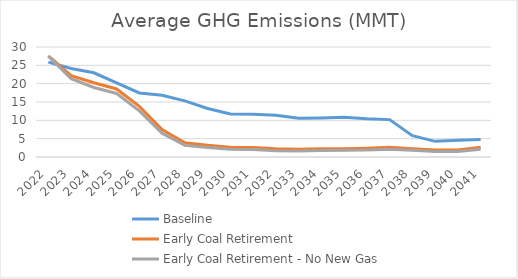
| Category | Baseline  | Early Coal Retirement | Early Coal Retirement - No New Gas |
|---|---|---|---|
| 2022.0 | 25.866 | 27.557 | 27.51 |
| 2023.0 | 24.132 | 22.194 | 21.382 |
| 2024.0 | 22.965 | 20.26 | 18.951 |
| 2025.0 | 20.221 | 18.551 | 17.324 |
| 2026.0 | 17.47 | 13.797 | 12.583 |
| 2027.0 | 16.821 | 7.47 | 6.486 |
| 2028.0 | 15.304 | 3.871 | 3.171 |
| 2029.0 | 13.24 | 3.177 | 2.569 |
| 2030.0 | 11.714 | 2.65 | 2.106 |
| 2031.0 | 11.659 | 2.621 | 2.038 |
| 2032.0 | 11.365 | 2.232 | 1.713 |
| 2033.0 | 10.539 | 2.122 | 1.633 |
| 2034.0 | 10.647 | 2.231 | 1.745 |
| 2035.0 | 10.854 | 2.275 | 1.825 |
| 2036.0 | 10.431 | 2.388 | 1.897 |
| 2037.0 | 10.193 | 2.631 | 2.147 |
| 2038.0 | 5.83 | 2.257 | 1.86 |
| 2039.0 | 4.27 | 1.878 | 1.518 |
| 2040.0 | 4.572 | 1.941 | 1.513 |
| 2041.0 | 4.748 | 2.636 | 2.097 |